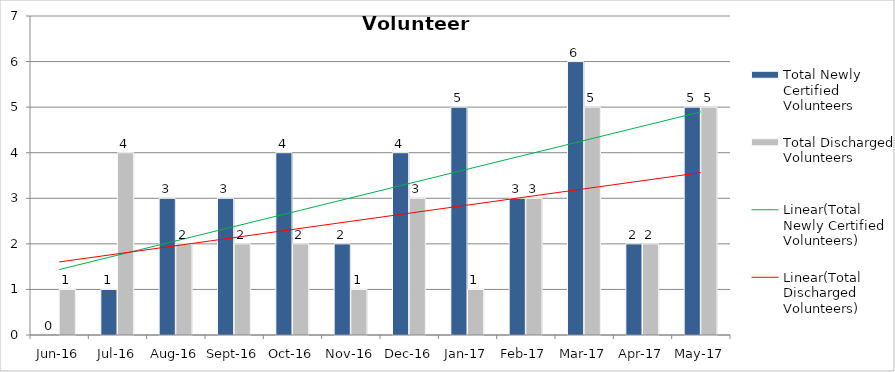
| Category | Total Newly Certified Volunteers | Total Discharged Volunteers |
|---|---|---|
| Jun-16 | 0 | 1 |
| Jul-16 | 1 | 4 |
| Aug-16 | 3 | 2 |
| Sep-16 | 3 | 2 |
| Oct-16 | 4 | 2 |
| Nov-16 | 2 | 1 |
| Dec-16 | 4 | 3 |
| Jan-17 | 5 | 1 |
| Feb-17 | 3 | 3 |
| Mar-17 | 6 | 5 |
| Apr-17 | 2 | 2 |
| May-17 | 5 | 5 |